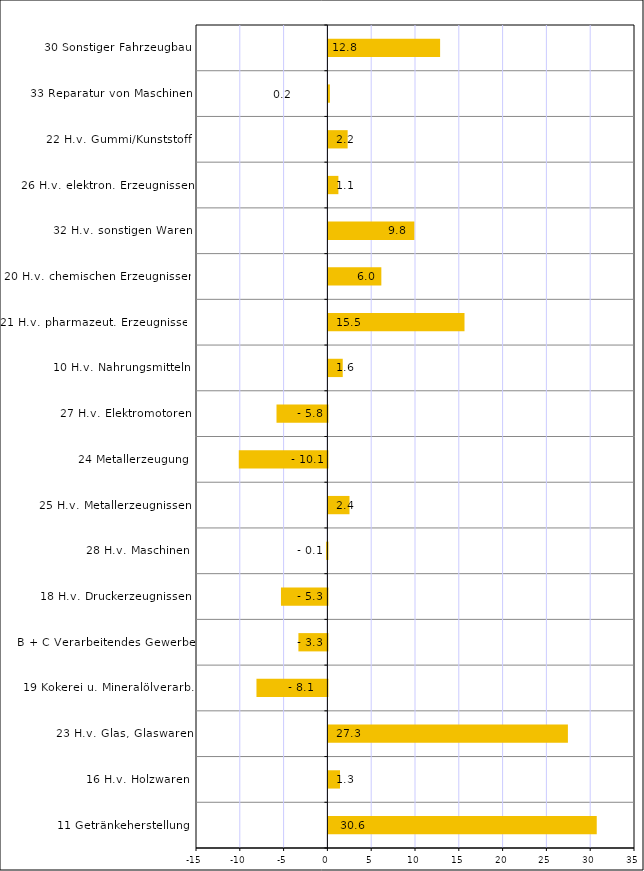
| Category | Series 0 |
|---|---|
| 11 Getränkeherstellung | 30.633 |
| 16 H.v. Holzwaren | 1.324 |
| 23 H.v. Glas, Glaswaren | 27.341 |
| 19 Kokerei u. Mineralölverarb. | -8.097 |
| B + C Verarbeitendes Gewerbe | -3.31 |
| 18 H.v. Druckerzeugnissen | -5.301 |
| 28 H.v. Maschinen | -0.143 |
| 25 H.v. Metallerzeugnissen | 2.408 |
| 24 Metallerzeugung | -10.117 |
| 27 H.v. Elektromotoren | -5.81 |
| 10 H.v. Nahrungsmitteln | 1.637 |
| 21 H.v. pharmazeut. Erzeugnissen | 15.537 |
| 20 H.v. chemischen Erzeugnissen | 6.044 |
| 32 H.v. sonstigen Waren | 9.809 |
| 26 H.v. elektron. Erzeugnissen | 1.14 |
| 22 H.v. Gummi/Kunststoff | 2.197 |
| 33 Reparatur von Maschinen | 0.173 |
| 30 Sonstiger Fahrzeugbau | 12.752 |